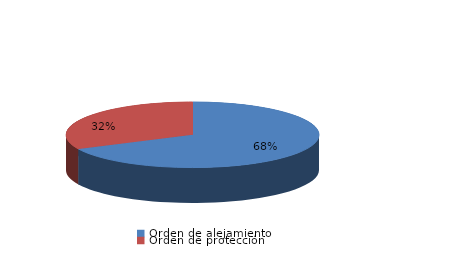
| Category | Series 0 |
|---|---|
| Orden de alejamiento | 19 |
| Orden de protección | 9 |